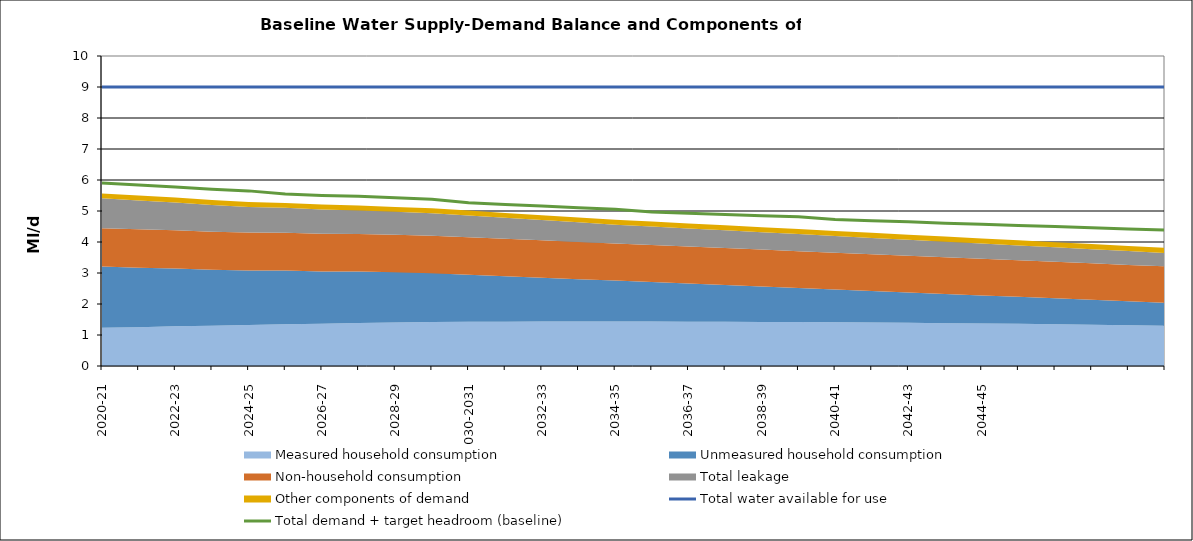
| Category | Total water available for use | Total demand + target headroom (baseline) |
|---|---|---|
| 0 | 9 | 5.903 |
| 1 | 9 | 5.838 |
| 2 | 9 | 5.777 |
| 3 | 9 | 5.702 |
| 4 | 9 | 5.649 |
| 5 | 9 | 5.546 |
| 6 | 9 | 5.498 |
| 7 | 9 | 5.473 |
| 8 | 9 | 5.427 |
| 9 | 9 | 5.381 |
| 10 | 9 | 5.266 |
| 11 | 9 | 5.209 |
| 12 | 9 | 5.158 |
| 13 | 9 | 5.103 |
| 14 | 9 | 5.055 |
| 15 | 9 | 4.967 |
| 16 | 9 | 4.928 |
| 17 | 9 | 4.89 |
| 18 | 9 | 4.849 |
| 19 | 9 | 4.811 |
| 20 | 9 | 4.726 |
| 21 | 9 | 4.687 |
| 22 | 9 | 4.65 |
| 23 | 9 | 4.608 |
| 24 | 9 | 4.576 |
| 25 | 9 | 4.534 |
| 26 | 9 | 4.497 |
| 27 | 9 | 4.46 |
| 28 | 9 | 4.422 |
| 29 | 9 | 4.385 |